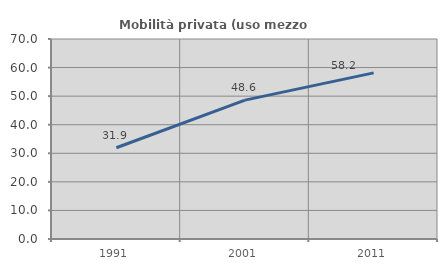
| Category | Mobilità privata (uso mezzo privato) |
|---|---|
| 1991.0 | 31.935 |
| 2001.0 | 48.603 |
| 2011.0 | 58.151 |